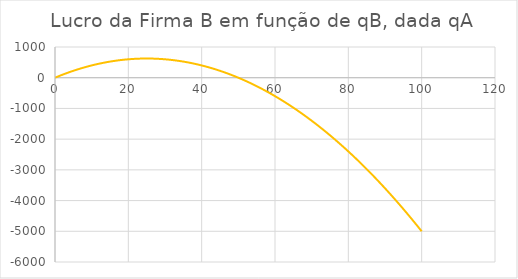
| Category | Series 0 |
|---|---|
| 0.0 | 0 |
| 1.0 | 49 |
| 2.0 | 96 |
| 3.0 | 141 |
| 4.0 | 184 |
| 5.0 | 225 |
| 6.0 | 264 |
| 7.0 | 301 |
| 8.0 | 336 |
| 9.0 | 369 |
| 10.0 | 400 |
| 11.0 | 429 |
| 12.0 | 456 |
| 13.0 | 481 |
| 14.0 | 504 |
| 15.0 | 525 |
| 16.0 | 544 |
| 17.0 | 561 |
| 18.0 | 576 |
| 19.0 | 589 |
| 20.0 | 600 |
| 21.0 | 609 |
| 22.0 | 616 |
| 23.0 | 621 |
| 24.0 | 624 |
| 25.0 | 625 |
| 26.0 | 624 |
| 27.0 | 621 |
| 28.0 | 616 |
| 29.0 | 609 |
| 30.0 | 600 |
| 31.0 | 589 |
| 32.0 | 576 |
| 33.0 | 561 |
| 34.0 | 544 |
| 35.0 | 525 |
| 36.0 | 504 |
| 37.0 | 481 |
| 38.0 | 456 |
| 39.0 | 429 |
| 40.0 | 400 |
| 41.0 | 369 |
| 42.0 | 336 |
| 43.0 | 301 |
| 44.0 | 264 |
| 45.0 | 225 |
| 46.0 | 184 |
| 47.0 | 141 |
| 48.0 | 96 |
| 49.0 | 49 |
| 50.0 | 0 |
| 51.0 | -51 |
| 52.0 | -104 |
| 53.0 | -159 |
| 54.0 | -216 |
| 55.0 | -275 |
| 56.0 | -336 |
| 57.0 | -399 |
| 58.0 | -464 |
| 59.0 | -531 |
| 60.0 | -600 |
| 61.0 | -671 |
| 62.0 | -744 |
| 63.0 | -819 |
| 64.0 | -896 |
| 65.0 | -975 |
| 66.0 | -1056 |
| 67.0 | -1139 |
| 68.0 | -1224 |
| 69.0 | -1311 |
| 70.0 | -1400 |
| 71.0 | -1491 |
| 72.0 | -1584 |
| 73.0 | -1679 |
| 74.0 | -1776 |
| 75.0 | -1875 |
| 76.0 | -1976 |
| 77.0 | -2079 |
| 78.0 | -2184 |
| 79.0 | -2291 |
| 80.0 | -2400 |
| 81.0 | -2511 |
| 82.0 | -2624 |
| 83.0 | -2739 |
| 84.0 | -2856 |
| 85.0 | -2975 |
| 86.0 | -3096 |
| 87.0 | -3219 |
| 88.0 | -3344 |
| 89.0 | -3471 |
| 90.0 | -3600 |
| 91.0 | -3731 |
| 92.0 | -3864 |
| 93.0 | -3999 |
| 94.0 | -4136 |
| 95.0 | -4275 |
| 96.0 | -4416 |
| 97.0 | -4559 |
| 98.0 | -4704 |
| 99.0 | -4851 |
| 100.0 | -5000 |